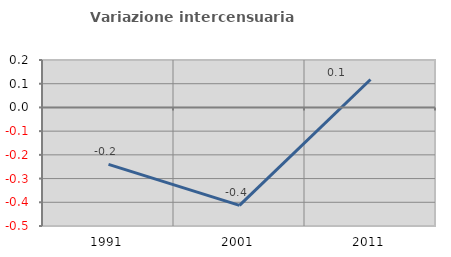
| Category | Variazione intercensuaria annua |
|---|---|
| 1991.0 | -0.24 |
| 2001.0 | -0.413 |
| 2011.0 | 0.118 |